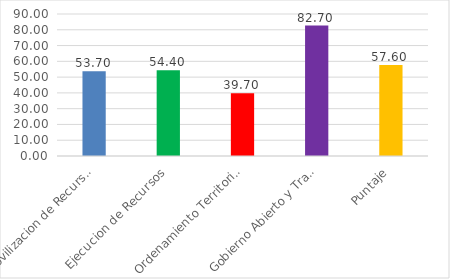
| Category | Series 0 |
|---|---|
| Movilizacion de Recursos | 53.7 |
| Ejecucion de Recursos | 54.4 |
| Ordenamiento Territorial | 39.7 |
| Gobierno Abierto y Transparencia | 82.7 |
| Puntaje | 57.6 |